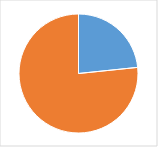
| Category | Series 0 |
|---|---|
| 0 | 0.229 |
| 1 | 0.75 |
| 2 | 0 |